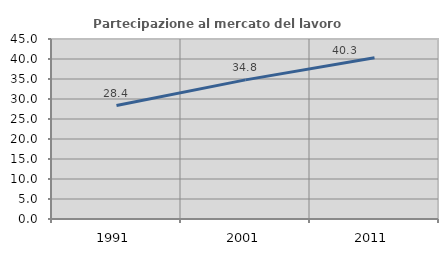
| Category | Partecipazione al mercato del lavoro  femminile |
|---|---|
| 1991.0 | 28.37 |
| 2001.0 | 34.783 |
| 2011.0 | 40.304 |